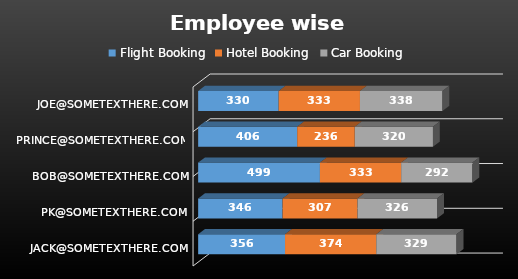
| Category | Flight Booking | Hotel Booking | Car Booking |
|---|---|---|---|
| Jack@sometexthere.com | 356 | 374 | 329 |
| PK@sometexthere.com | 346 | 307 | 326 |
| Bob@sometexthere.com | 499 | 333 | 292 |
| Prince@sometexthere.com | 406 | 236 | 320 |
| Joe@sometexthere.com | 330 | 333 | 338 |